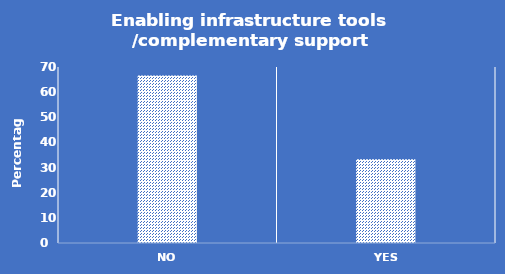
| Category | Percent |
|---|---|
| No | 66.667 |
| Yes | 33.333 |